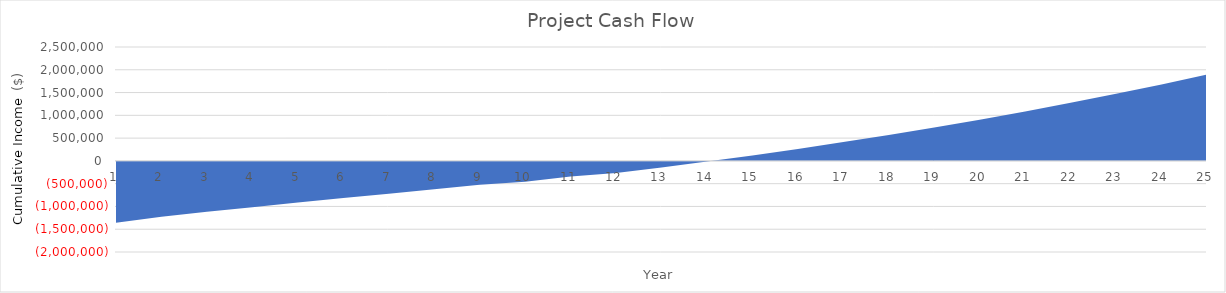
| Category | Series 0 |
|---|---|
| 0 | -1358134 |
| 1 | -1227294.4 |
| 2 | -1116422.096 |
| 3 | -1015869.66 |
| 4 | -911272.025 |
| 5 | -813079.157 |
| 6 | -721095.715 |
| 7 | -624477.694 |
| 8 | -523011.053 |
| 9 | -456472.33 |
| 10 | -344628.24 |
| 11 | -267235.253 |
| 12 | -144039.16 |
| 13 | -14774.614 |
| 14 | 120835.341 |
| 15 | 263079.766 |
| 16 | 412260.342 |
| 17 | 568691.905 |
| 18 | 732703.01 |
| 19 | 904636.505 |
| 20 | 1084850.145 |
| 21 | 1273717.219 |
| 22 | 1471627.212 |
| 23 | 1678986.488 |
| 24 | 1896219.003 |